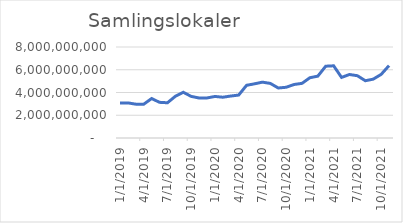
| Category | Samlingslokaler |
|---|---|
| 1/1/19 | 3080712500 |
| 2/1/19 | 3085437500 |
| 3/1/19 | 2974317916.667 |
| 4/1/19 | 2969481250 |
| 5/1/19 | 3468897500 |
| 6/1/19 | 3135806666.667 |
| 7/1/19 | 3097775833.333 |
| 8/1/19 | 3667455000 |
| 9/1/19 | 4022948333.333 |
| 10/1/19 | 3656506666.667 |
| 11/1/19 | 3517002500 |
| 12/1/19 | 3520869166.667 |
| 1/1/20 | 3651952500 |
| 2/1/20 | 3585631666.667 |
| 3/1/20 | 3689602500 |
| 4/1/20 | 3773285833.333 |
| 5/1/20 | 4633356666.667 |
| 6/1/20 | 4762760833.333 |
| 7/1/20 | 4908966666.667 |
| 8/1/20 | 4798891666.667 |
| 9/1/20 | 4395541666.667 |
| 10/1/20 | 4460250000 |
| 11/1/20 | 4704717500 |
| 12/1/20 | 4802142500 |
| 1/1/21 | 5298613333.333 |
| 2/1/21 | 5436330000 |
| 3/1/21 | 6312063333.333 |
| 4/1/21 | 6346867500 |
| 5/1/21 | 5325250833.333 |
| 6/1/21 | 5583846666.667 |
| 7/1/21 | 5475680000 |
| 8/1/21 | 5035292500 |
| 9/1/21 | 5174409166.667 |
| 10/1/21 | 5589521666.667 |
| 11/1/21 | 6363758333.333 |